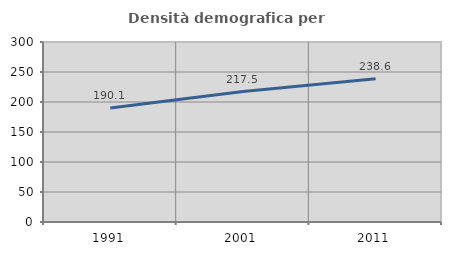
| Category | Densità demografica |
|---|---|
| 1991.0 | 190.083 |
| 2001.0 | 217.486 |
| 2011.0 | 238.557 |